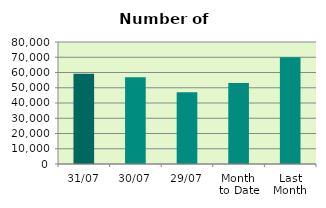
| Category | Series 0 |
|---|---|
| 31/07 | 59194 |
| 30/07 | 56936 |
| 29/07 | 46988 |
| Month 
to Date | 53071.913 |
| Last
Month | 70062.455 |